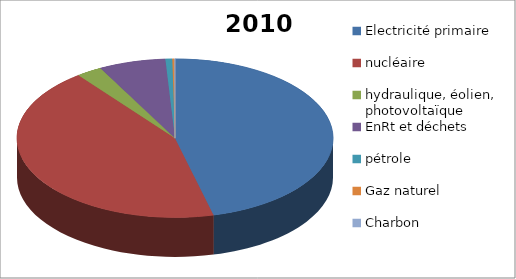
| Category | 2010 |
|---|---|
| Electricité primaire | 118.4 |
| nucléaire | 111.7 |
| hydraulique, éolien, photovoltaïque | 6.7 |
| EnRt et déchets | 17.6 |
| pétrole | 1.8 |
| Gaz naturel | 0.6 |
| Charbon | 0.1 |